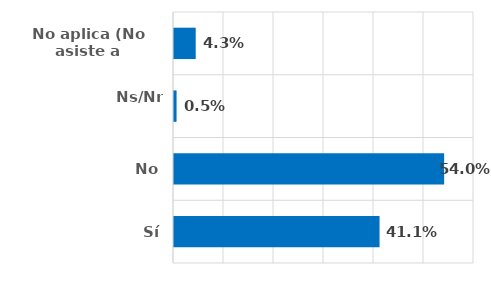
| Category | Series 0 |
|---|---|
| Sí | 0.411 |
| No | 0.54 |
| Ns/Nr | 0.005 |
| No aplica (No asiste a presentaciones) | 0.043 |